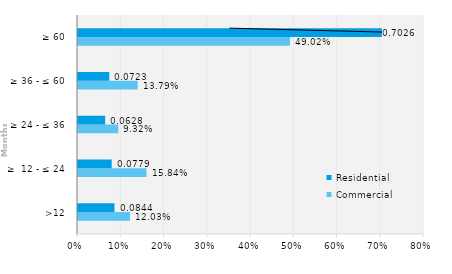
| Category | Commercial | Residential |
|---|---|---|
| >12 | 0.12 | 0.084 |
| ≥  12 - ≤ 24 | 0.158 | 0.078 |
| ≥ 24 - ≤ 36 | 0.093 | 0.063 |
| ≥ 36 - ≤ 60 | 0.138 | 0.072 |
| ≥ 60 | 0.49 | 0.703 |